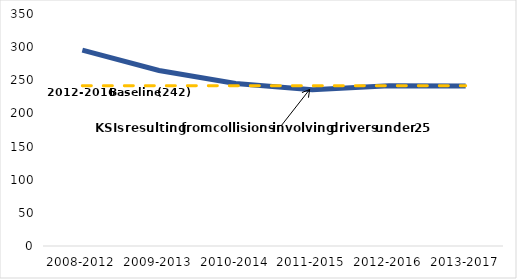
| Category | Number of KSIs1** | 2012-2016 Baseline |
|---|---|---|
| 2008-2012 | 295.4 | 241.8 |
| 2009-2013 | 264.8 | 241.8 |
| 2010-2014 | 245.2 | 241.8 |
| 2011-2015 | 235.8 | 241.8 |
| 2012-2016 | 241.8 | 241.8 |
| 2013-2017 | 241.4 | 241.8 |